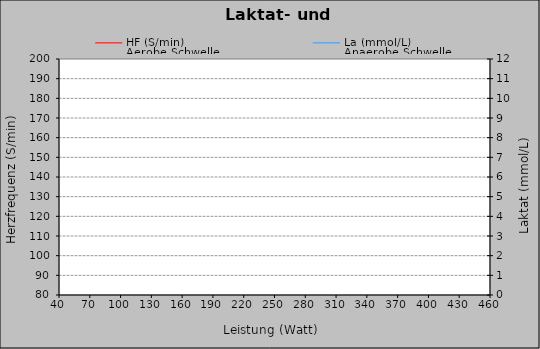
| Category | HF (S/min) |
|---|---|
| 0 | 0 |
| 1 | 0 |
| 2 | 0 |
| 3 | 0 |
| 4 | 0 |
| 5 | 0 |
| 6 | 0 |
| 7 | 0 |
| 8 | 0 |
| 9 | 0 |
| 10 | 0 |
| 11 | 0 |